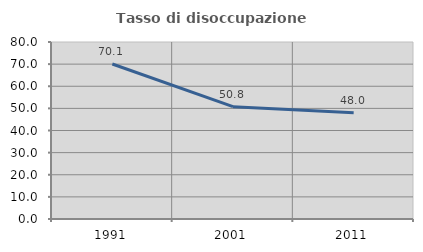
| Category | Tasso di disoccupazione giovanile  |
|---|---|
| 1991.0 | 70.056 |
| 2001.0 | 50.763 |
| 2011.0 | 47.972 |